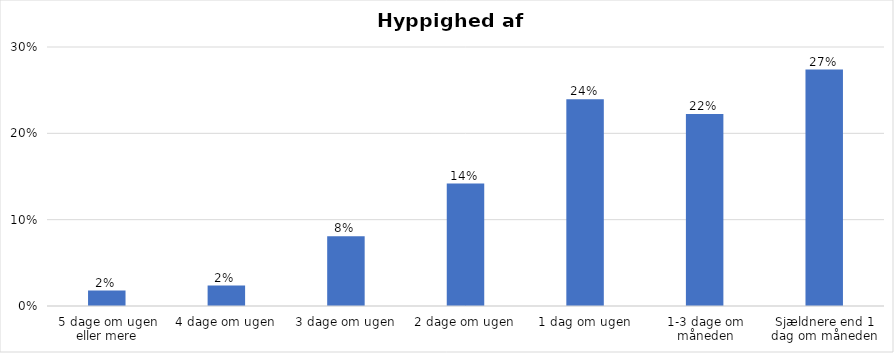
| Category | % |
|---|---|
| 5 dage om ugen eller mere | 0.018 |
| 4 dage om ugen | 0.024 |
| 3 dage om ugen | 0.081 |
| 2 dage om ugen | 0.142 |
| 1 dag om ugen | 0.24 |
| 1-3 dage om måneden | 0.222 |
| Sjældnere end 1 dag om måneden | 0.274 |